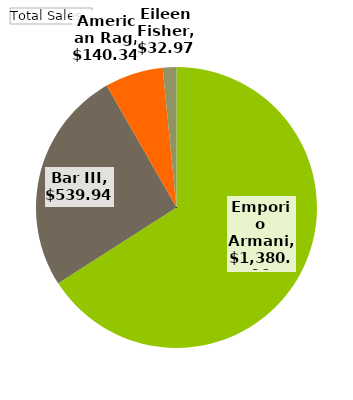
| Category | Total |
|---|---|
| Emporio Armani | 1380.06 |
| Bar III | 539.94 |
| American Rag | 140.34 |
| Eileen Fisher | 32.97 |